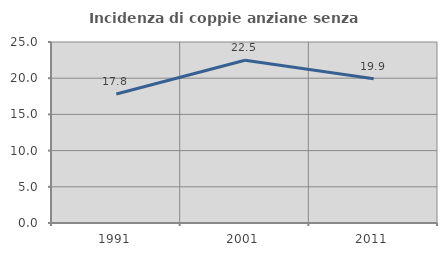
| Category | Incidenza di coppie anziane senza figli  |
|---|---|
| 1991.0 | 17.808 |
| 2001.0 | 22.483 |
| 2011.0 | 19.932 |